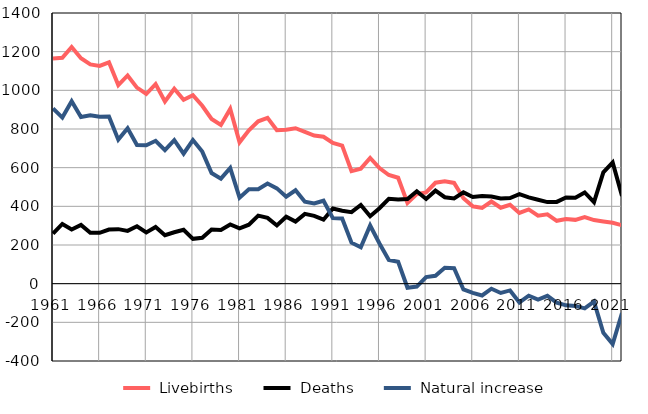
| Category |  Livebirths |  Deaths |  Natural increase |
|---|---|---|---|
| 1961.0 | 1165 | 259 | 906 |
| 1962.0 | 1168 | 309 | 859 |
| 1963.0 | 1224 | 280 | 944 |
| 1964.0 | 1166 | 304 | 862 |
| 1965.0 | 1134 | 263 | 871 |
| 1966.0 | 1126 | 263 | 863 |
| 1967.0 | 1145 | 280 | 865 |
| 1968.0 | 1027 | 282 | 745 |
| 1969.0 | 1077 | 273 | 804 |
| 1970.0 | 1014 | 297 | 717 |
| 1971.0 | 981 | 265 | 716 |
| 1972.0 | 1032 | 293 | 739 |
| 1973.0 | 942 | 251 | 691 |
| 1974.0 | 1008 | 266 | 742 |
| 1975.0 | 951 | 279 | 672 |
| 1976.0 | 975 | 232 | 743 |
| 1977.0 | 920 | 237 | 683 |
| 1978.0 | 852 | 280 | 572 |
| 1979.0 | 821 | 278 | 543 |
| 1980.0 | 904 | 306 | 598 |
| 1981.0 | 731 | 286 | 445 |
| 1982.0 | 793 | 305 | 488 |
| 1983.0 | 840 | 352 | 488 |
| 1984.0 | 858 | 340 | 518 |
| 1985.0 | 794 | 301 | 493 |
| 1986.0 | 796 | 346 | 450 |
| 1987.0 | 804 | 321 | 483 |
| 1988.0 | 785 | 361 | 424 |
| 1989.0 | 766 | 351 | 415 |
| 1990.0 | 760 | 331 | 429 |
| 1991.0 | 728 | 389 | 339 |
| 1992.0 | 714 | 377 | 337 |
| 1993.0 | 582 | 370 | 212 |
| 1994.0 | 595 | 407 | 188 |
| 1995.0 | 650 | 349 | 301 |
| 1996.0 | 598 | 390 | 208 |
| 1997.0 | 562 | 439 | 123 |
| 1998.0 | 548 | 435 | 113 |
| 1999.0 | 417 | 438 | -21 |
| 2000.0 | 463 | 478 | -15 |
| 2001.0 | 472 | 438 | 34 |
| 2002.0 | 522 | 481 | 41 |
| 2003.0 | 529 | 447 | 82 |
| 2004.0 | 521 | 441 | 80 |
| 2005.0 | 442 | 472 | -30 |
| 2006.0 | 400 | 448 | -48 |
| 2007.0 | 392 | 453 | -61 |
| 2008.0 | 425 | 451 | -26 |
| 2009.0 | 393 | 441 | -48 |
| 2010.0 | 408 | 443 | -35 |
| 2011.0 | 366 | 463 | -97 |
| 2012.0 | 384 | 446 | -62 |
| 2013.0 | 352 | 434 | -82 |
| 2014.0 | 359 | 422 | -63 |
| 2015.0 | 325 | 423 | -98 |
| 2016.0 | 334 | 446 | -112 |
| 2017.0 | 330 | 445 | -115 |
| 2018.0 | 344 | 472 | -128 |
| 2019.0 | 329 | 422 | -93 |
| 2020.0 | 322 | 576 | -254 |
| 2021.0 | 315 | 627 | -312 |
| 2022.0 | 302 | 454 | -152 |